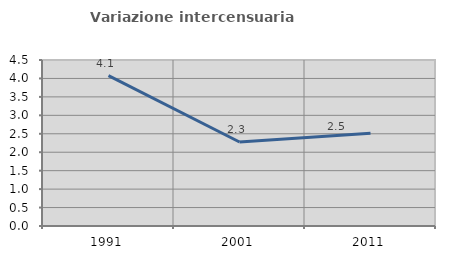
| Category | Variazione intercensuaria annua |
|---|---|
| 1991.0 | 4.078 |
| 2001.0 | 2.276 |
| 2011.0 | 2.513 |